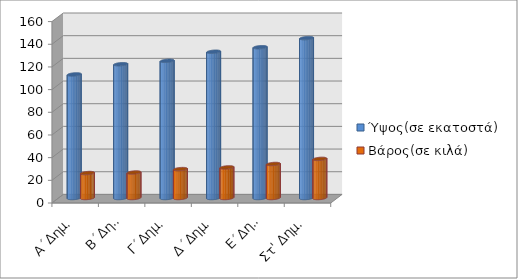
| Category | Ύψος(σε εκατοστά) | Βάρος(σε κιλά) |
|---|---|---|
| Α΄Δημ. | 109 | 22 |
| Β΄Δημ. | 118 | 22.5 |
| Γ΄Δημ. | 121 | 25.5 |
| Δ΄Δημ. | 129 | 27 |
| Ε΄Δημ. | 133 | 30 |
| Στ' Δημ. | 141 | 34.5 |